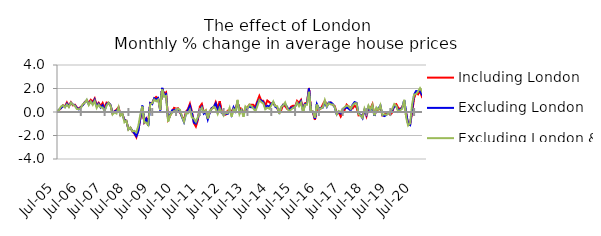
| Category | Including London | Excluding London | Excluding London & SE |
|---|---|---|---|
| 2005-07-01 | 0.014 | -0.006 | 0.09 |
| 2005-08-01 | 0.163 | 0.204 | 0.162 |
| 2005-09-01 | 0.324 | 0.325 | 0.462 |
| 2005-10-01 | 0.577 | 0.533 | 0.574 |
| 2005-11-01 | 0.466 | 0.417 | 0.391 |
| 2005-12-01 | 0.812 | 0.711 | 0.637 |
| 2006-01-01 | 0.5 | 0.49 | 0.413 |
| 2006-02-01 | 0.828 | 0.794 | 0.795 |
| 2006-03-01 | 0.563 | 0.637 | 0.633 |
| 2006-04-01 | 0.621 | 0.57 | 0.521 |
| 2006-05-01 | 0.386 | 0.352 | 0.256 |
| 2006-06-01 | 0.291 | 0.226 | 0.232 |
| 2006-07-01 | 0.438 | 0.412 | 0.342 |
| 2006-08-01 | 0.591 | 0.577 | 0.661 |
| 2006-09-01 | 0.848 | 0.81 | 0.786 |
| 2006-10-01 | 0.979 | 1.005 | 1.049 |
| 2006-11-01 | 0.775 | 0.651 | 0.593 |
| 2006-12-01 | 1.037 | 0.905 | 0.892 |
| 2007-01-01 | 0.858 | 0.697 | 0.609 |
| 2007-02-01 | 1.157 | 1.043 | 0.936 |
| 2007-03-01 | 0.591 | 0.493 | 0.34 |
| 2007-04-01 | 0.791 | 0.71 | 0.625 |
| 2007-05-01 | 0.495 | 0.385 | 0.394 |
| 2007-06-01 | 0.773 | 0.572 | 0.376 |
| 2007-07-01 | 0.314 | 0.122 | 0.088 |
| 2007-08-01 | 0.802 | 0.688 | 0.543 |
| 2007-09-01 | 0.779 | 0.781 | 0.791 |
| 2007-10-01 | 0.566 | 0.59 | 0.551 |
| 2007-11-01 | -0.121 | -0.088 | -0.213 |
| 2007-12-01 | 0.07 | 0.05 | -0.02 |
| 2008-01-01 | 0.193 | 0.09 | -0.129 |
| 2008-02-01 | 0.407 | 0.326 | 0.403 |
| 2008-03-01 | -0.27 | -0.262 | -0.309 |
| 2008-04-01 | -0.198 | -0.21 | -0.151 |
| 2008-05-01 | -0.666 | -0.685 | -0.88 |
| 2008-06-01 | -0.763 | -0.783 | -0.746 |
| 2008-07-01 | -1.456 | -1.471 | -1.501 |
| 2008-08-01 | -1.333 | -1.353 | -1.313 |
| 2008-09-01 | -1.666 | -1.602 | -1.648 |
| 2008-10-01 | -1.827 | -1.811 | -1.607 |
| 2008-11-01 | -2.152 | -2.056 | -1.731 |
| 2008-12-01 | -1.511 | -1.621 | -1.176 |
| 2009-01-01 | -0.593 | -0.517 | -0.245 |
| 2009-02-01 | 0.356 | 0.548 | 0.469 |
| 2009-03-01 | -0.862 | -0.838 | -0.892 |
| 2009-04-01 | -0.536 | -0.573 | -0.91 |
| 2009-05-01 | -0.786 | -1.169 | -1.113 |
| 2009-06-01 | 0.762 | 0.765 | 0.654 |
| 2009-07-01 | 0.77 | 0.668 | 0.757 |
| 2009-08-01 | 1.139 | 1.168 | 1.057 |
| 2009-09-01 | 1.284 | 1.066 | 0.915 |
| 2009-10-01 | 1.145 | 1.185 | 1.057 |
| 2009-11-01 | 0.204 | 0.132 | 0.175 |
| 2009-12-01 | 1.994 | 2.051 | 1.926 |
| 2010-01-01 | 1.536 | 1.399 | 1.297 |
| 2010-02-01 | 1.676 | 1.521 | 1.369 |
| 2010-03-01 | -0.651 | -0.718 | -0.827 |
| 2010-04-01 | -0.343 | -0.254 | -0.294 |
| 2010-05-01 | 0.049 | 0.144 | -0.074 |
| 2010-06-01 | 0.354 | 0.167 | 0.091 |
| 2010-07-01 | 0.283 | 0.116 | -0.045 |
| 2010-08-01 | 0.323 | 0.246 | 0.282 |
| 2010-09-01 | -0.047 | 0.051 | 0.181 |
| 2010-10-01 | -0.391 | -0.428 | -0.388 |
| 2010-11-01 | -0.701 | -0.847 | -0.825 |
| 2010-12-01 | 0.034 | -0.13 | -0.156 |
| 2011-01-01 | 0.244 | 0.162 | -0.115 |
| 2011-02-01 | 0.703 | 0.521 | 0.199 |
| 2011-03-01 | 0.059 | -0.093 | -0.469 |
| 2011-04-01 | -0.947 | -0.896 | -0.555 |
| 2011-05-01 | -1.241 | -0.98 | -0.829 |
| 2011-06-01 | -0.69 | -0.549 | -0.431 |
| 2011-07-01 | 0.458 | 0.212 | 0.054 |
| 2011-08-01 | 0.687 | 0.448 | 0.361 |
| 2011-09-01 | -0.023 | -0.142 | -0.013 |
| 2011-10-01 | 0.118 | 0.024 | 0.154 |
| 2011-11-01 | -0.58 | -0.635 | -0.549 |
| 2011-12-01 | 0.04 | -0.052 | 0.097 |
| 2012-01-01 | 0.333 | 0.333 | 0.235 |
| 2012-02-01 | 0.371 | 0.455 | 0.454 |
| 2012-03-01 | 0.836 | 0.719 | 0.266 |
| 2012-04-01 | 0.354 | 0.041 | -0.17 |
| 2012-05-01 | 0.924 | 0.531 | 0.33 |
| 2012-06-01 | -0.009 | -0.088 | -0.008 |
| 2012-07-01 | -0.101 | -0.157 | -0.313 |
| 2012-08-01 | -0.222 | -0.149 | -0.056 |
| 2012-09-01 | 0.107 | -0.167 | -0.111 |
| 2012-10-01 | 0.182 | 0.18 | 0.355 |
| 2012-11-01 | 0.049 | -0.244 | -0.405 |
| 2012-12-01 | 0.313 | 0.4 | 0.24 |
| 2013-01-01 | 0.306 | 0.087 | 0.068 |
| 2013-02-01 | 0.812 | 0.894 | 1.028 |
| 2013-03-01 | 0.345 | 0.054 | -0.185 |
| 2013-04-01 | 0.271 | 0.195 | 0.178 |
| 2013-05-01 | -0.069 | -0.184 | -0.413 |
| 2013-06-01 | 0.154 | 0.189 | 0.469 |
| 2013-07-01 | 0.387 | 0.362 | 0.318 |
| 2013-08-01 | 0.627 | 0.449 | 0.637 |
| 2013-09-01 | 0.614 | 0.397 | 0.507 |
| 2013-10-01 | 0.608 | 0.414 | 0.301 |
| 2013-11-01 | 0.433 | 0.181 | 0.067 |
| 2013-12-01 | 0.932 | 0.793 | 0.508 |
| 2014-01-01 | 1.371 | 1.039 | 1.01 |
| 2014-02-01 | 0.968 | 0.974 | 0.843 |
| 2014-03-01 | 0.953 | 0.835 | 0.729 |
| 2014-04-01 | 0.53 | 0.345 | 0.232 |
| 2014-05-01 | 0.977 | 0.529 | 0.368 |
| 2014-06-01 | 0.841 | 0.457 | 0.28 |
| 2014-07-01 | 0.675 | 0.715 | 0.55 |
| 2014-08-01 | 0.759 | 0.82 | 0.894 |
| 2014-09-01 | 0.533 | 0.443 | 0.501 |
| 2014-10-01 | 0.322 | 0.36 | 0.496 |
| 2014-11-01 | -0.008 | -0.021 | -0.17 |
| 2014-12-01 | 0.156 | 0.384 | 0.434 |
| 2015-01-01 | 0.598 | 0.617 | 0.551 |
| 2015-02-01 | 0.48 | 0.685 | 0.811 |
| 2015-03-01 | 0.272 | 0.423 | 0.331 |
| 2015-04-01 | 0.21 | 0.118 | 0.074 |
| 2015-05-01 | 0.449 | 0.351 | 0.211 |
| 2015-06-01 | 0.537 | 0.353 | 0.352 |
| 2015-07-01 | 0.463 | 0.465 | 0.426 |
| 2015-08-01 | 0.947 | 0.741 | 0.809 |
| 2015-09-01 | 0.767 | 0.655 | 0.494 |
| 2015-10-01 | 1.027 | 0.909 | 0.799 |
| 2015-11-01 | 0.191 | 0.085 | -0.057 |
| 2015-12-01 | 0.742 | 0.676 | 0.617 |
| 2016-01-01 | 0.805 | 0.681 | 0.612 |
| 2016-02-01 | 2.049 | 1.995 | 1.717 |
| 2016-03-01 | 0.139 | 0.043 | 0.039 |
| 2016-04-01 | -0.033 | 0.019 | 0.047 |
| 2016-05-01 | -0.677 | -0.587 | -0.483 |
| 2016-06-01 | 0.364 | 0.673 | 0.627 |
| 2016-07-01 | 0.169 | 0.309 | 0.195 |
| 2016-08-01 | 0.3 | 0.345 | 0.303 |
| 2016-09-01 | 0.633 | 0.377 | 0.395 |
| 2016-10-01 | 0.948 | 0.834 | 1.008 |
| 2016-11-01 | 0.616 | 0.446 | 0.473 |
| 2016-12-01 | 0.749 | 0.812 | 0.741 |
| 2017-01-01 | 0.808 | 0.802 | 0.649 |
| 2017-02-01 | 0.604 | 0.688 | 0.644 |
| 2017-03-01 | 0.501 | 0.389 | 0.426 |
| 2017-04-01 | -0.081 | -0.197 | -0.192 |
| 2017-05-01 | -0.038 | 0.018 | 0.084 |
| 2017-06-01 | -0.387 | -0.117 | -0.018 |
| 2017-07-01 | -0.049 | 0.194 | 0.262 |
| 2017-08-01 | 0.161 | 0.324 | 0.42 |
| 2017-09-01 | 0.631 | 0.378 | 0.54 |
| 2017-10-01 | 0.465 | 0.291 | 0.497 |
| 2017-11-01 | 0.38 | 0.138 | 0.262 |
| 2017-12-01 | 0.306 | 0.611 | 0.544 |
| 2018-01-01 | 0.546 | 0.845 | 0.735 |
| 2018-02-01 | 0.383 | 0.778 | 0.741 |
| 2018-03-01 | -0.286 | -0.128 | -0.179 |
| 2018-04-01 | -0.269 | -0.244 | -0.297 |
| 2018-05-01 | -0.322 | -0.529 | -0.491 |
| 2018-06-01 | 0.146 | 0.189 | 0.303 |
| 2018-07-01 | -0.37 | -0.221 | -0.081 |
| 2018-08-01 | 0.285 | 0.453 | 0.544 |
| 2018-09-01 | 0.297 | 0.134 | 0.197 |
| 2018-10-01 | 0.665 | 0.476 | 0.595 |
| 2018-11-01 | -0.272 | -0.333 | -0.287 |
| 2018-12-01 | 0.2 | 0.273 | 0.369 |
| 2019-01-01 | 0.193 | 0.267 | 0.169 |
| 2019-02-01 | 0.447 | 0.564 | 0.586 |
| 2019-03-01 | -0.294 | -0.25 | -0.252 |
| 2019-04-01 | -0.254 | -0.346 | -0.194 |
| 2019-05-01 | -0.028 | -0.257 | -0.237 |
| 2019-06-01 | -0.075 | -0.051 | -0.147 |
| 2019-07-01 | -0.233 | 0.013 | 0.043 |
| 2019-08-01 | -0.044 | 0.159 | 0.262 |
| 2019-09-01 | 0.58 | 0.463 | 0.674 |
| 2019-10-01 | 0.673 | 0.496 | 0.523 |
| 2019-11-01 | 0.347 | 0.144 | 0.023 |
| 2019-12-01 | 0.257 | 0.222 | 0.16 |
| 2020-01-01 | 0.427 | 0.358 | 0.271 |
| 2020-02-01 | 0.783 | 1.017 | 1.035 |
| 2020-03-01 | -0.07 | -0.106 | -0.462 |
| 2020-04-01 | -1.082 | -1.021 | -1.144 |
| 2020-05-01 | -1.058 | -1.117 | -0.961 |
| 2020-06-01 | -0.032 | 0.225 | 0.665 |
| 2020-07-01 | 1.17 | 1.475 | 1.485 |
| 2020-08-01 | 1.648 | 1.783 | 1.524 |
| 2020-09-01 | 1.507 | 1.763 | 1.756 |
| 2020-10-01 | 1.772 | 1.766 | 2.038 |
| 2020-11-01 | 1.274 | 1.471 | 1.749 |
| 2020-12-01 | 1.328 | 1.242 | 1.314 |
| 2021-01-01 | 1.174 | 1.232 | 1.302 |